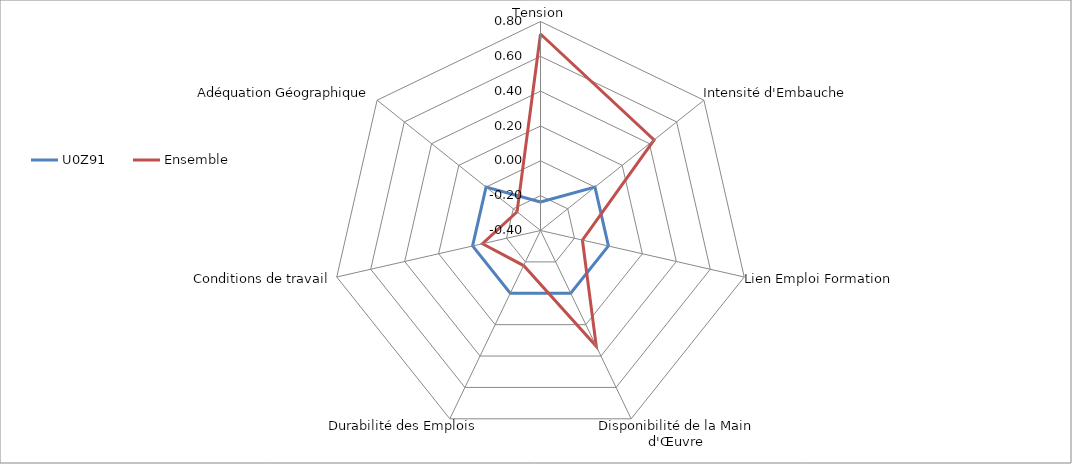
| Category | U0Z91 | Ensemble |
|---|---|---|
| Tension | -0.236 | 0.728 |
| Intensité d'Embauche | 0 | 0.434 |
| Lien Emploi Formation | 0 | -0.153 |
| Disponibilité de la Main d'Œuvre | 0 | 0.338 |
| Durabilité des Emplois | 0 | -0.177 |
| Conditions de travail | 0 | -0.058 |
| Adéquation Géographique | 0 | -0.228 |